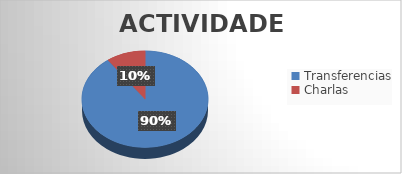
| Category | Series 0 |
|---|---|
| Transferencias | 9 |
| Charlas | 1 |